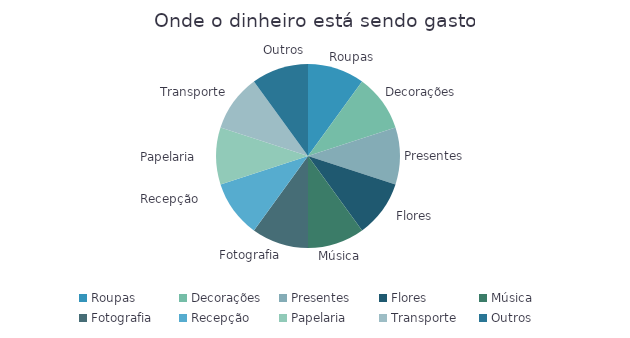
| Category | Valor |
|---|---|
| Roupas | 1 |
| Decorações | 1 |
| Presentes | 1 |
| Flores | 1 |
| Música | 1 |
| Fotografia | 1 |
| Recepção | 1 |
| Papelaria | 1 |
| Transporte | 1 |
| Outros | 1 |